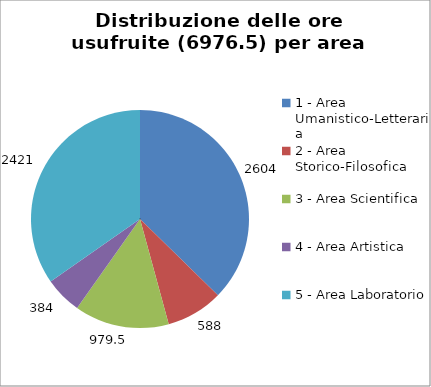
| Category | Nr. Ore Usufruite |
|---|---|
| 1 - Area Umanistico-Letteraria | 2604 |
| 2 - Area Storico-Filosofica | 588 |
| 3 - Area Scientifica | 979.5 |
| 4 - Area Artistica | 384 |
| 5 - Area Laboratorio | 2421 |